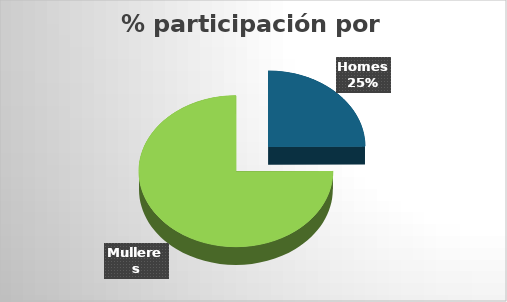
| Category | Series 0 |
|---|---|
| Homes | 110 |
| Mulleres | 331 |